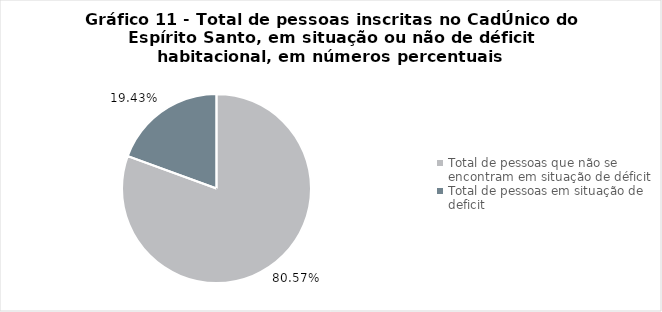
| Category | Series 0 |
|---|---|
| Total de pessoas que não se encontram em situação de déficit | 0.806 |
| Total de pessoas em situação de deficit | 0.194 |